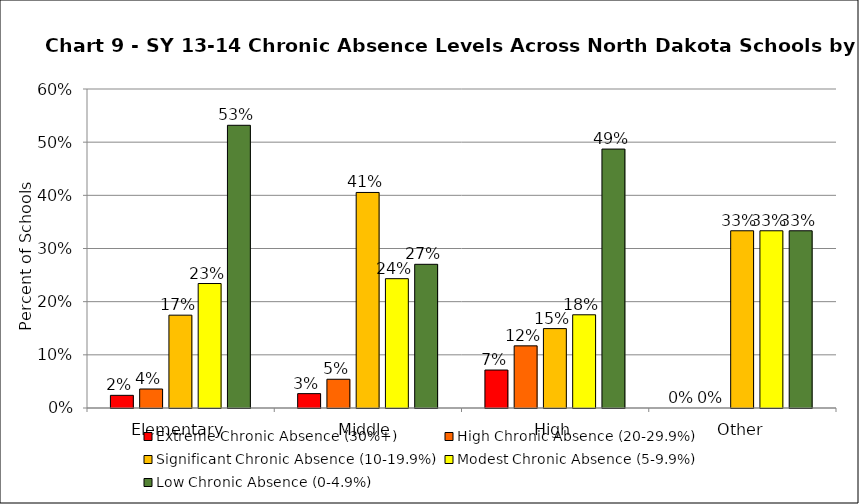
| Category | Extreme Chronic Absence (30%+) | High Chronic Absence (20-29.9%) | Significant Chronic Absence (10-19.9%) | Modest Chronic Absence (5-9.9%) | Low Chronic Absence (0-4.9%) |
|---|---|---|---|---|---|
| 0 | 0.024 | 0.036 | 0.175 | 0.234 | 0.532 |
| 1 | 0.027 | 0.054 | 0.405 | 0.243 | 0.27 |
| 2 | 0.071 | 0.117 | 0.149 | 0.175 | 0.487 |
| 3 | 0 | 0 | 0.333 | 0.333 | 0.333 |